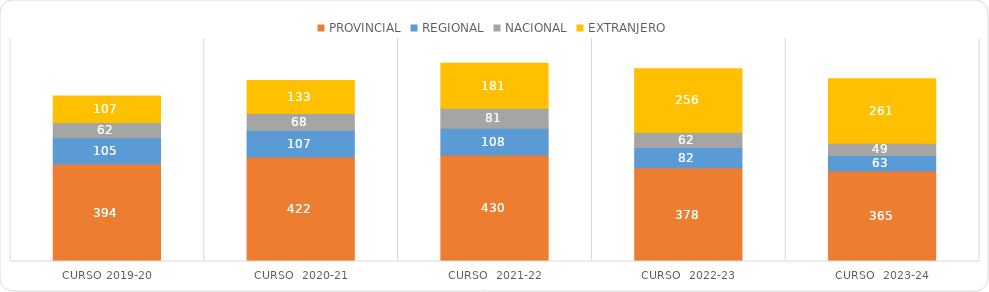
| Category | PROVINCIAL | REGIONAL | NACIONAL | EXTRANJERO |
|---|---|---|---|---|
| Curso 2019-20 | 394 | 105 | 62 | 107 |
| Curso  2020-21 | 422 | 107 | 68 | 133 |
| Curso  2021-22 | 430 | 108 | 81 | 181 |
| Curso  2022-23 | 378 | 82 | 62 | 256 |
| Curso  2023-24 | 365 | 63 | 49 | 261 |